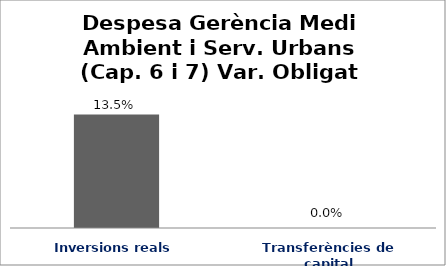
| Category | Series 0 |
|---|---|
| Inversions reals | 0.135 |
| Transferències de capital | 0 |